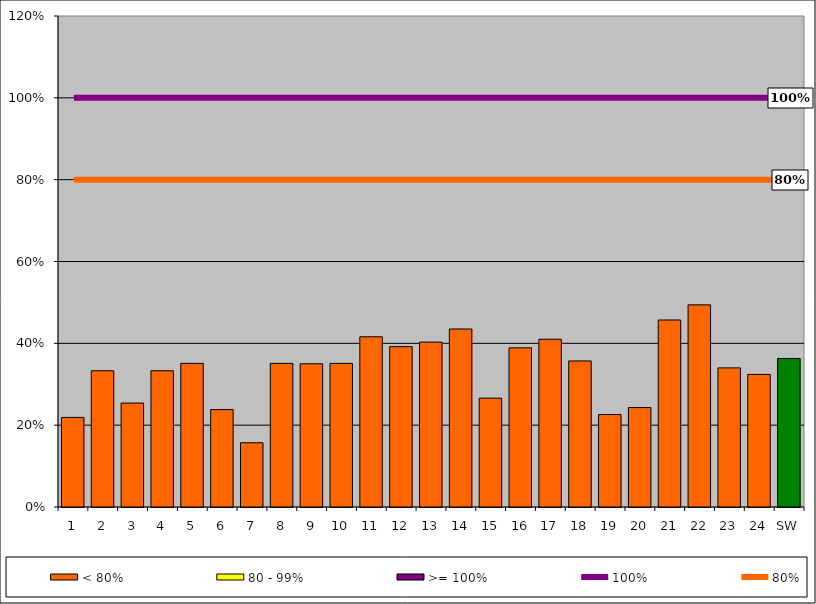
| Category | < 80% | 80 - 99% | >= 100% |
|---|---|---|---|
| 1 | 0.219 | 0 | 0 |
| 2 | 0.333 | 0 | 0 |
| 3 | 0.254 | 0 | 0 |
| 4 | 0.333 | 0 | 0 |
| 5 | 0.351 | 0 | 0 |
| 6 | 0.238 | 0 | 0 |
| 7 | 0.157 | 0 | 0 |
| 8 | 0.351 | 0 | 0 |
| 9 | 0.35 | 0 | 0 |
| 10 | 0.351 | 0 | 0 |
| 11 | 0.416 | 0 | 0 |
| 12 | 0.392 | 0 | 0 |
| 13 | 0.403 | 0 | 0 |
| 14 | 0.435 | 0 | 0 |
| 15 | 0.266 | 0 | 0 |
| 16 | 0.389 | 0 | 0 |
| 17 | 0.41 | 0 | 0 |
| 18 | 0.357 | 0 | 0 |
| 19 | 0.226 | 0 | 0 |
| 20 | 0.243 | 0 | 0 |
| 21 | 0.457 | 0 | 0 |
| 22 | 0.494 | 0 | 0 |
| 23 | 0.34 | 0 | 0 |
| 24 | 0.324 | 0 | 0 |
| SW | 0.363 | 0 | 0 |